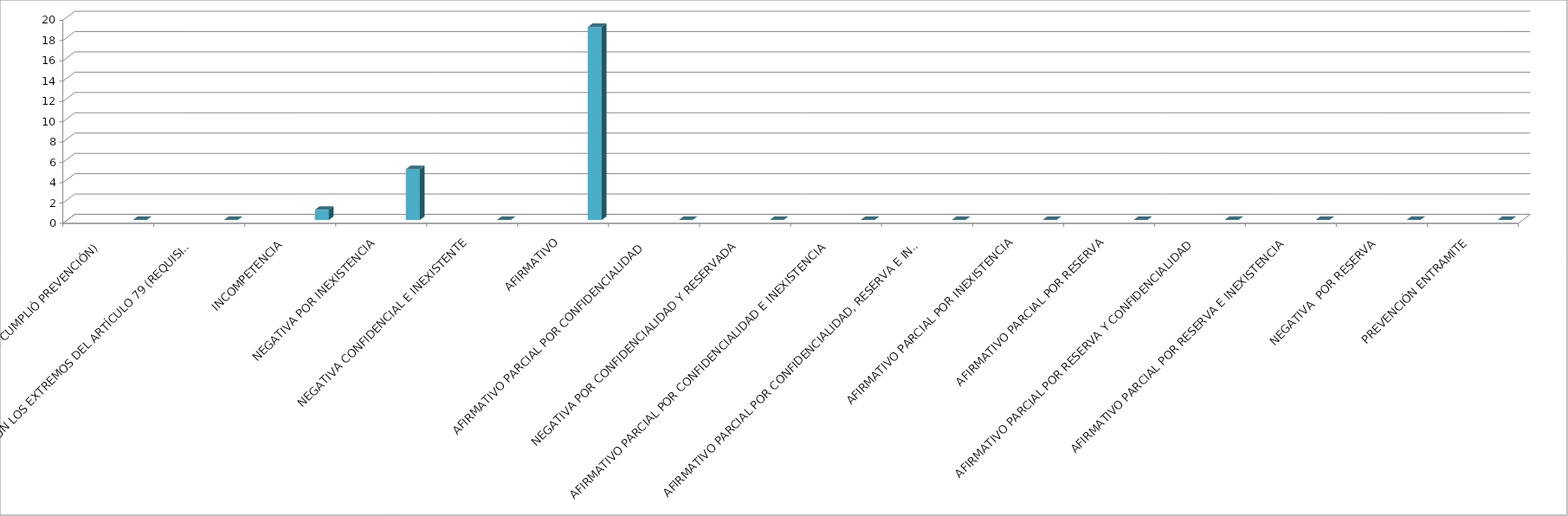
| Category | Series 0 | Series 1 | Series 2 | Series 3 | Series 4 |
|---|---|---|---|---|---|
| SE TIENE POR NO PRESENTADA ( NO CUMPLIÓ PREVENCIÓN) |  |  |  |  | 0 |
| NO CUMPLIO CON LOS EXTREMOS DEL ARTÍCULO 79 (REQUISITOS) |  |  |  |  | 0 |
| INCOMPETENCIA  |  |  |  |  | 1 |
| NEGATIVA POR INEXISTENCIA |  |  |  |  | 5 |
| NEGATIVA CONFIDENCIAL E INEXISTENTE |  |  |  |  | 0 |
| AFIRMATIVO |  |  |  |  | 19 |
| AFIRMATIVO PARCIAL POR CONFIDENCIALIDAD  |  |  |  |  | 0 |
| NEGATIVA POR CONFIDENCIALIDAD Y RESERVADA |  |  |  |  | 0 |
| AFIRMATIVO PARCIAL POR CONFIDENCIALIDAD E INEXISTENCIA |  |  |  |  | 0 |
| AFIRMATIVO PARCIAL POR CONFIDENCIALIDAD, RESERVA E INEXISTENCIA |  |  |  |  | 0 |
| AFIRMATIVO PARCIAL POR INEXISTENCIA |  |  |  |  | 0 |
| AFIRMATIVO PARCIAL POR RESERVA |  |  |  |  | 0 |
| AFIRMATIVO PARCIAL POR RESERVA Y CONFIDENCIALIDAD |  |  |  |  | 0 |
| AFIRMATIVO PARCIAL POR RESERVA E INEXISTENCIA |  |  |  |  | 0 |
| NEGATIVA  POR RESERVA |  |  |  |  | 0 |
| PREVENCIÓN ENTRAMITE |  |  |  |  | 0 |